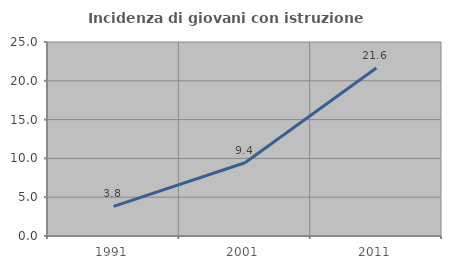
| Category | Incidenza di giovani con istruzione universitaria |
|---|---|
| 1991.0 | 3.81 |
| 2001.0 | 9.444 |
| 2011.0 | 21.649 |